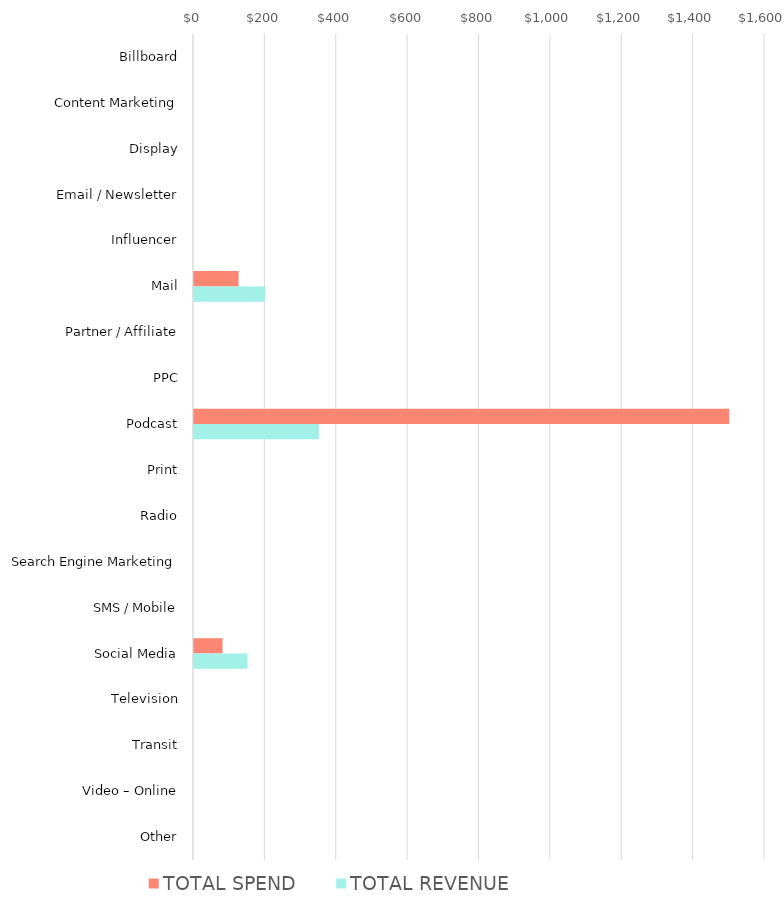
| Category | TOTAL SPEND | TOTAL REVENUE |
|---|---|---|
| Billboard | 0 | 0 |
| Content Marketing | 0 | 0 |
| Display | 0 | 0 |
| Email / Newsletter | 0 | 0 |
| Influencer | 0 | 0 |
| Mail | 125 | 200 |
| Partner / Affiliate | 0 | 0 |
| PPC | 0 | 0 |
| Podcast | 1500 | 350 |
| Print | 0 | 0 |
| Radio | 0 | 0 |
| Search Engine Marketing | 0 | 0 |
| SMS / Mobile | 0 | 0 |
| Social Media | 80 | 150 |
| Television | 0 | 0 |
| Transit | 0 | 0 |
| Video – Online | 0 | 0 |
| Other | 0 | 0 |